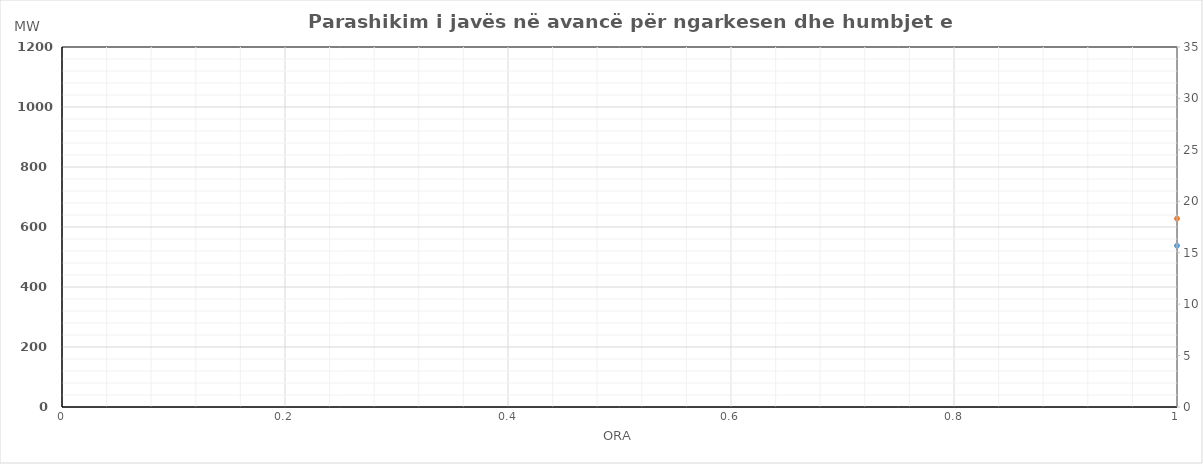
| Category | Ngarkesa (MWh) |
|---|---|
| 0 | 627.932 |
| 1 | 572.501 |
| 2 | 544.028 |
| 3 | 530.306 |
| 4 | 527.537 |
| 5 | 554.256 |
| 6 | 637.698 |
| 7 | 770.198 |
| 8 | 873.619 |
| 9 | 917.827 |
| 10 | 915.317 |
| 11 | 942.298 |
| 12 | 938.609 |
| 13 | 937.471 |
| 14 | 938.371 |
| 15 | 911.794 |
| 16 | 876.983 |
| 17 | 876.955 |
| 18 | 915.329 |
| 19 | 941.911 |
| 20 | 998.565 |
| 21 | 923.393 |
| 22 | 830.292 |
| 23 | 719.564 |
| 24 | 659.611 |
| 25 | 603.3 |
| 26 | 577.869 |
| 27 | 561.451 |
| 28 | 557.142 |
| 29 | 579.745 |
| 30 | 641.377 |
| 31 | 752.836 |
| 32 | 855.881 |
| 33 | 914.038 |
| 34 | 931.746 |
| 35 | 944.816 |
| 36 | 925.844 |
| 37 | 908.514 |
| 38 | 878.755 |
| 39 | 863.119 |
| 40 | 869.212 |
| 41 | 896.66 |
| 42 | 925.054 |
| 43 | 967.602 |
| 44 | 988.329 |
| 45 | 927.896 |
| 46 | 827.961 |
| 47 | 727.433 |
| 48 | 643.772 |
| 49 | 587.901 |
| 50 | 560.948 |
| 51 | 545.878 |
| 52 | 542.339 |
| 53 | 567 |
| 54 | 639.537 |
| 55 | 761.517 |
| 56 | 864.75 |
| 57 | 915.932 |
| 58 | 923.531 |
| 59 | 943.557 |
| 60 | 932.227 |
| 61 | 922.993 |
| 62 | 908.563 |
| 63 | 887.456 |
| 64 | 873.097 |
| 65 | 886.807 |
| 66 | 920.192 |
| 67 | 954.756 |
| 68 | 993.447 |
| 69 | 925.644 |
| 70 | 829.126 |
| 71 | 723.499 |
| 72 | 671.822 |
| 73 | 615.779 |
| 74 | 584.898 |
| 75 | 565.614 |
| 76 | 560.997 |
| 77 | 577.281 |
| 78 | 634.649 |
| 79 | 746.75 |
| 80 | 851.65 |
| 81 | 911.831 |
| 82 | 937.735 |
| 83 | 947.544 |
| 84 | 925.135 |
| 85 | 915.207 |
| 86 | 873.085 |
| 87 | 853.085 |
| 88 | 860.165 |
| 89 | 884.013 |
| 90 | 922.921 |
| 91 | 955.014 |
| 92 | 990.828 |
| 93 | 926.589 |
| 94 | 823.284 |
| 95 | 727.415 |
| 96 | 628.288 |
| 97 | 577.687 |
| 98 | 547.401 |
| 99 | 533.415 |
| 100 | 533.625 |
| 101 | 563.721 |
| 102 | 642.891 |
| 103 | 769.435 |
| 104 | 874.213 |
| 105 | 916.804 |
| 106 | 931.534 |
| 107 | 948.012 |
| 108 | 956.934 |
| 109 | 955.851 |
| 110 | 932.042 |
| 111 | 912.737 |
| 112 | 909.188 |
| 113 | 925.421 |
| 114 | 954.099 |
| 115 | 983.452 |
| 116 | 1012.852 |
| 117 | 934.371 |
| 118 | 830.52 |
| 119 | 726.443 |
| 120 | 650.055 |
| 121 | 596.733 |
| 122 | 566.15 |
| 123 | 549.515 |
| 124 | 547.311 |
| 125 | 570.501 |
| 126 | 638.77 |
| 127 | 758.092 |
| 128 | 862.931 |
| 129 | 914.318 |
| 130 | 934.634 |
| 131 | 947.778 |
| 132 | 941.034 |
| 133 | 935.529 |
| 134 | 902.564 |
| 135 | 882.911 |
| 136 | 884.676 |
| 137 | 904.717 |
| 138 | 938.51 |
| 139 | 969.233 |
| 140 | 1001.84 |
| 141 | 930.48 |
| 142 | 826.902 |
| 143 | 726.929 |
| 144 | 638.348 |
| 145 | 583.698 |
| 146 | 560.888 |
| 147 | 546.306 |
| 148 | 545.738 |
| 149 | 574.257 |
| 150 | 655.314 |
| 151 | 785.777 |
| 152 | 889.614 |
| 153 | 933.391 |
| 154 | 956.429 |
| 155 | 982.775 |
| 156 | 995.758 |
| 157 | 997.96 |
| 158 | 976.091 |
| 159 | 959.377 |
| 160 | 953.738 |
| 161 | 968.157 |
| 162 | 989.124 |
| 163 | 1013.95 |
| 164 | 1051.11 |
| 165 | 973.238 |
| 166 | 866.965 |
| 167 | 762.841 |